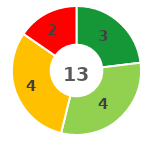
| Category | Series 0 |
|---|---|
| 0 | 3 |
| 1 | 4 |
| 2 | 4 |
| 3 | 2 |
| 4 | 0 |